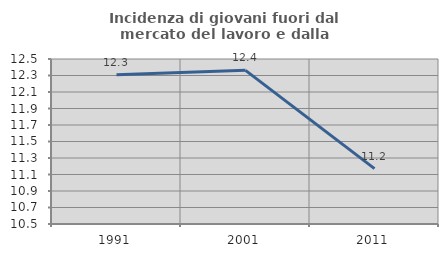
| Category | Incidenza di giovani fuori dal mercato del lavoro e dalla formazione  |
|---|---|
| 1991.0 | 12.308 |
| 2001.0 | 12.363 |
| 2011.0 | 11.171 |